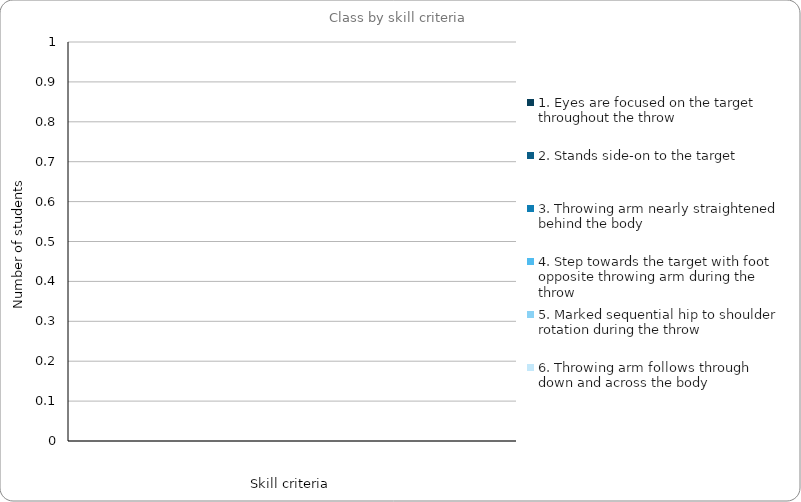
| Category | 1. Eyes are focused on the target throughout the throw | 2. Stands side-on to the target  | 3. Throwing arm nearly straightened behind the body | 4. Step towards the target with foot opposite throwing arm during the throw | 5. Marked sequential hip to shoulder rotation during the throw | 6. Throwing arm follows through down and across the body |
|---|---|---|---|---|---|---|
| 0 | 0 | 0 | 0 | 0 | 0 | 0 |